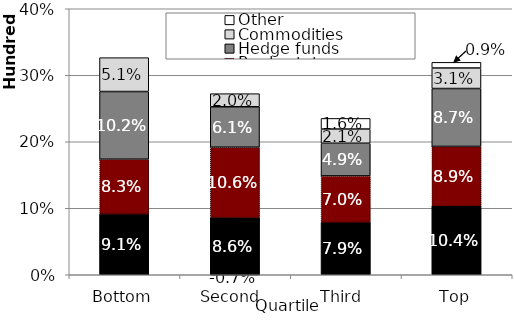
| Category | Private equity | Real estate | Hedge funds | Commodities | Other |
|---|---|---|---|---|---|
| Bottom | 9.122 | 8.252 | 10.178 | 5.094 | 0 |
| Second  | 8.603 | 10.576 | 6.085 | 1.968 | -0.73 |
| Third  | 7.906 | 6.956 | 4.913 | 2.136 | 1.6 |
| Top | 10.363 | 8.933 | 8.708 | 3.085 | 0.854 |